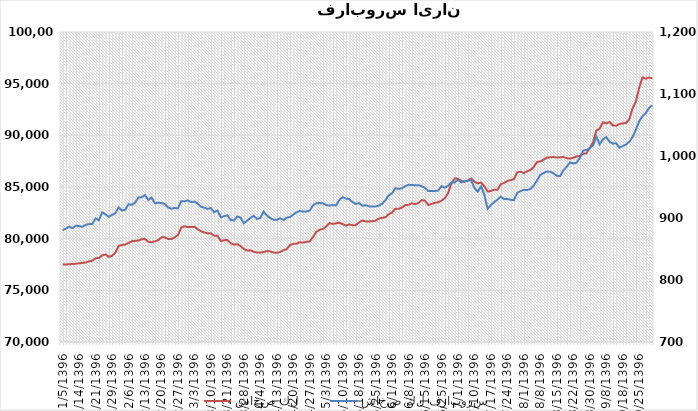
| Category | شاخص كل |
|---|---|
| 1396-01-05 | 77485.8 |
| 1396-01-06 | 77502.9 |
| 1396-01-07 | 77523.3 |
| 1396-01-08 | 77548.5 |
| 1396-01-09 | 77584.4 |
| 1396-01-14 | 77616.8 |
| 1396-01-15 | 77647.1 |
| 1396-01-16 | 77689.9 |
| 1396-01-19 | 77804.7 |
| 1396-01-20 | 77860.4 |
| 1396-01-21 | 78107.8 |
| 1396-01-23 | 78132.4 |
| 1396-01-26 | 78383.3 |
| 1396-01-27 | 78471.7 |
| 1396-01-28 | 78247.5 |
| 1396-01-29 | 78339.8 |
| 1396-01-30 | 78651.4 |
| 1396-02-02 | 79302.7 |
| 1396-02-03 | 79390.6 |
| 1396-02-04 | 79425.9 |
| 1396-02-06 | 79596.9 |
| 1396-02-09 | 79755.6 |
| 1396-02-10 | 79785 |
| 1396-02-11 | 79826.6 |
| 1396-02-12 | 79942.1 |
| 1396-02-13 | 79969.2 |
| 1396-02-16 | 79697.4 |
| 1396-02-17 | 79660.9 |
| 1396-02-18 | 79744.1 |
| 1396-02-19 | 79858.8 |
| 1396-02-20 | 80127.1 |
| 1396-02-23 | 80142 |
| 1396-02-24 | 79963 |
| 1396-02-25 | 79957.5 |
| 1396-02-26 | 80129.3 |
| 1396-02-27 | 80344.2 |
| 1396-02-30 | 81077.6 |
| 1396-02-31 | 81194 |
| 1396-03-01 | 81124.4 |
| 1396-03-02 | 81124.4 |
| 1396-03-03 | 81146.2 |
| 1396-03-06 | 80921.2 |
| 1396-03-07 | 80713.2 |
| 1396-03-08 | 80607.9 |
| 1396-03-09 | 80511.5 |
| 1396-03-10 | 80513.3 |
| 1396-03-13 | 80288.9 |
| 1396-03-16 | 80293.5 |
| 1396-03-17 | 79758.5 |
| 1396-03-20 | 79855.7 |
| 1396-03-21 | 79870.7 |
| 1396-03-22 | 79564.1 |
| 1396-03-23 | 79426.9 |
| 1396-03-24 | 79465.7 |
| 1396-03-27 | 79285 |
| 1396-03-28 | 78990.4 |
| 1396-03-29 | 78859.2 |
| 1396-03-30 | 78867.5 |
| 1396-03-31 | 78736.2 |
| 1396-04-03 | 78652.7 |
| 1396-04-04 | 78665.5 |
| 1396-04-07 | 78704.5 |
| 1396-04-10 | 78799.7 |
| 1396-04-11 | 78765.3 |
| 1396-04-12 | 78659.2 |
| 1396-04-13 | 78632.5 |
| 1396-04-14 | 78700.2 |
| 1396-04-17 | 78881.6 |
| 1396-04-18 | 78985.4 |
| 1396-04-19 | 79377 |
| 1396-04-20 | 79490.4 |
| 1396-04-21 | 79509.6 |
| 1396-04-24 | 79658.9 |
| 1396-04-25 | 79620.8 |
| 1396-04-26 | 79692.9 |
| 1396-04-27 | 79735.7 |
| 1396-04-28 | 80162.5 |
| 1396-04-31 | 80670.8 |
| 1396-05-01 | 80863 |
| 1396-05-02 | 80933.9 |
| 1396-05-03 | 81181.7 |
| 1396-05-04 | 81509.3 |
| 1396-05-07 | 81420.9 |
| 1396-05-08 | 81491.4 |
| 1396-05-09 | 81533.5 |
| 1396-05-10 | 81415.9 |
| 1396-05-11 | 81265.9 |
| 1396-05-15 | 81384.1 |
| 1396-05-16 | 81285.7 |
| 1396-05-17 | 81313.9 |
| 1396-05-18 | 81579.3 |
| 1396-05-21 | 81763.1 |
| 1396-05-22 | 81661.5 |
| 1396-05-23 | 81659.3 |
| 1396-05-24 | 81696.3 |
| 1396-05-25 | 81741.9 |
| 1396-05-28 | 81954.9 |
| 1396-05-29 | 82016.2 |
| 1396-05-30 | 82075 |
| 1396-05-31 | 82372.4 |
| 1396-06-01 | 82541.8 |
| 1396-06-04 | 82897.1 |
| 1396-06-05 | 82885 |
| 1396-06-06 | 83012.1 |
| 1396-06-07 | 83252 |
| 1396-06-08 | 83272.9 |
| 1396-06-11 | 83428.2 |
| 1396-06-12 | 83345.2 |
| 1396-06-13 | 83452.1 |
| 1396-06-14 | 83733.5 |
| 1396-06-15 | 83675.3 |
| 1396-06-19 | 83255.7 |
| 1396-06-20 | 83369.1 |
| 1396-06-21 | 83469.2 |
| 1396-06-22 | 83523.8 |
| 1396-06-25 | 83683.2 |
| 1396-06-26 | 83916.6 |
| 1396-06-27 | 84414.5 |
| 1396-06-28 | 85343.9 |
| 1396-06-29 | 85831.8 |
| 1396-07-01 | 85798.4 |
| 1396-07-02 | 85588.8 |
| 1396-07-03 | 85516.9 |
| 1396-07-04 | 85628.8 |
| 1396-07-05 | 85819 |
| 1396-07-10 | 85514.9 |
| 1396-07-11 | 85355 |
| 1396-07-12 | 85429.5 |
| 1396-07-15 | 85069.5 |
| 1396-07-16 | 84564.9 |
| 1396-07-17 | 84611.6 |
| 1396-07-18 | 84734.4 |
| 1396-07-19 | 84744.1 |
| 1396-07-22 | 85263.6 |
| 1396-07-23 | 85394.9 |
| 1396-07-24 | 85590.7 |
| 1396-07-25 | 85660 |
| 1396-07-26 | 85768 |
| 1396-07-29 | 86430.5 |
| 1396-07-30 | 86480.2 |
| 1396-08-01 | 86346.2 |
| 1396-08-02 | 86529.2 |
| 1396-08-03 | 86636.8 |
| 1396-08-06 | 86935.4 |
| 1396-08-07 | 87416.6 |
| 1396-08-08 | 87477.2 |
| 1396-08-09 | 87649.9 |
| 1396-08-10 | 87844.9 |
| 1396-08-13 | 87868.6 |
| 1396-08-14 | 87905.1 |
| 1396-08-15 | 87843.7 |
| 1396-08-16 | 87883.1 |
| 1396-08-17 | 87897.4 |
| 1396-08-20 | 87795.2 |
| 1396-08-21 | 87744.7 |
| 1396-08-22 | 87832.5 |
| 1396-08-23 | 87949.8 |
| 1396-08-24 | 88005.9 |
| 1396-08-27 | 88202.3 |
| 1396-08-29 | 88261.2 |
| 1396-08-30 | 88774.6 |
| 1396-09-01 | 89339.1 |
| 1396-09-04 | 90469.5 |
| 1396-09-05 | 90655.5 |
| 1396-09-07 | 91255.2 |
| 1396-09-08 | 91152.2 |
| 1396-09-11 | 91296.7 |
| 1396-09-12 | 90951.8 |
| 1396-09-13 | 90936.6 |
| 1396-09-14 | 91092.2 |
| 1396-09-18 | 91160.3 |
| 1396-09-19 | 91198.9 |
| 1396-09-20 | 91552.4 |
| 1396-09-21 | 92628.9 |
| 1396-09-22 | 93283.7 |
| 1396-09-25 | 94606.424 |
| 1396-09-26 | 95600.749 |
| 1396-09-27 | 95477.406 |
| 1396-09-28 | 95590.611 |
| 1396-09-29 | 95508.639 |